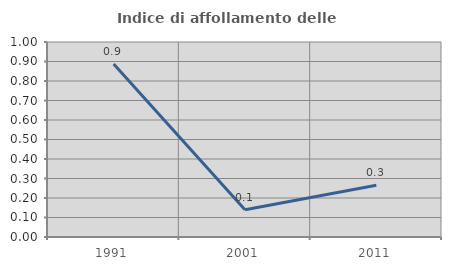
| Category | Indice di affollamento delle abitazioni  |
|---|---|
| 1991.0 | 0.888 |
| 2001.0 | 0.14 |
| 2011.0 | 0.265 |